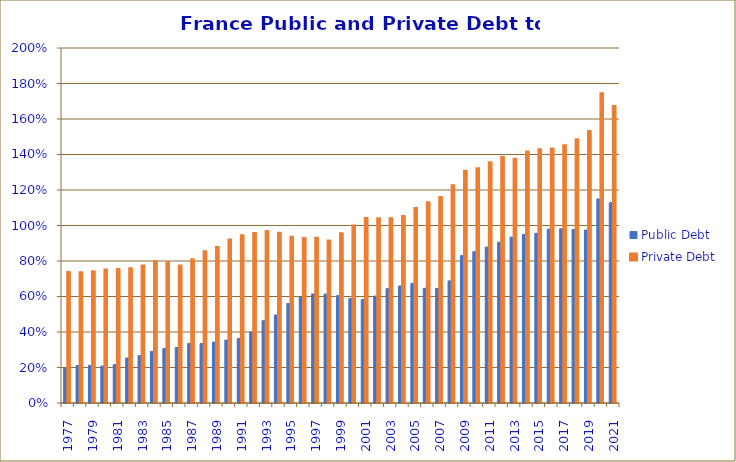
| Category | Public Debt | Private Debt |
|---|---|---|
| 1977.0 | 0.198 | 0.737 |
| 1978.0 | 0.211 | 0.737 |
| 1979.0 | 0.211 | 0.742 |
| 1980.0 | 0.208 | 0.752 |
| 1981.0 | 0.216 | 0.755 |
| 1982.0 | 0.254 | 0.759 |
| 1983.0 | 0.267 | 0.775 |
| 1984.0 | 0.291 | 0.8 |
| 1985.0 | 0.307 | 0.793 |
| 1986.0 | 0.313 | 0.774 |
| 1987.0 | 0.336 | 0.811 |
| 1988.0 | 0.335 | 0.855 |
| 1989.0 | 0.343 | 0.88 |
| 1990.0 | 0.355 | 0.921 |
| 1991.0 | 0.363 | 0.945 |
| 1992.0 | 0.4 | 0.958 |
| 1993.0 | 0.463 | 0.968 |
| 1994.0 | 0.496 | 0.959 |
| 1995.0 | 0.561 | 0.937 |
| 1996.0 | 0.6 | 0.929 |
| 1997.0 | 0.614 | 0.931 |
| 1998.0 | 0.613 | 0.916 |
| 1999.0 | 0.605 | 0.957 |
| 2000.0 | 0.589 | 1 |
| 2001.0 | 0.583 | 1.043 |
| 2002.0 | 0.603 | 1.041 |
| 2003.0 | 0.644 | 1.04 |
| 2004.0 | 0.659 | 1.053 |
| 2005.0 | 0.674 | 1.098 |
| 2006.0 | 0.646 | 1.131 |
| 2007.0 | 0.645 | 1.161 |
| 2008.0 | 0.688 | 1.226 |
| 2009.0 | 0.83 | 1.309 |
| 2010.0 | 0.853 | 1.322 |
| 2011.0 | 0.878 | 1.356 |
| 2012.0 | 0.906 | 1.386 |
| 2013.0 | 0.934 | 1.376 |
| 2014.0 | 0.949 | 1.417 |
| 2015.0 | 0.956 | 1.43 |
| 2016.0 | 0.98 | 1.433 |
| 2017.0 | 0.981 | 1.453 |
| 2018.0 | 0.978 | 1.486 |
| 2019.0 | 0.974 | 1.533 |
| 2020.0 | 1.15 | 1.746 |
| 2021.0 | 1.128 | 1.673 |